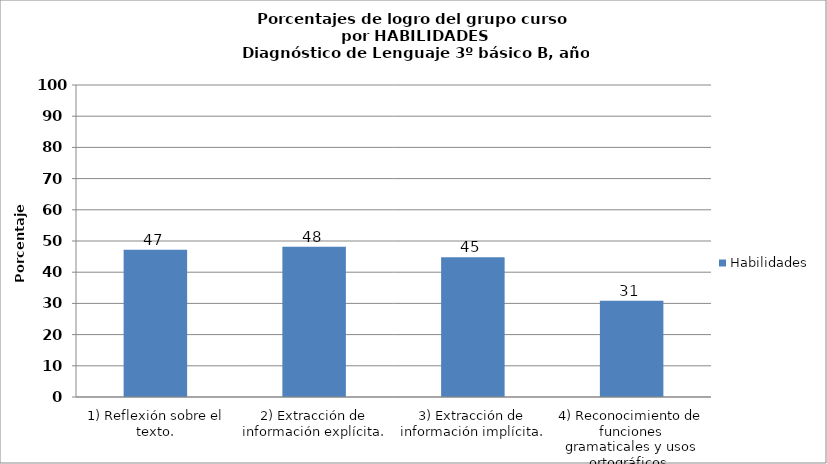
| Category | Habilidades |
|---|---|
| 1) Reflexión sobre el texto. | 47.222 |
| 2) Extracción de información explícita. | 48.148 |
| 3) Extracción de información implícita. | 44.753 |
| 4) Reconocimiento de funciones gramaticales y usos ortográficos. | 30.864 |